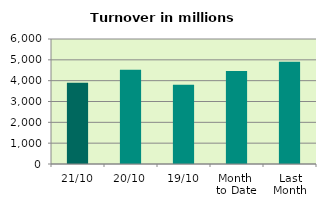
| Category | Series 0 |
|---|---|
| 21/10 | 3899.858 |
| 20/10 | 4518.356 |
| 19/10 | 3807.943 |
| Month 
to Date | 4463.699 |
| Last
Month | 4910.879 |